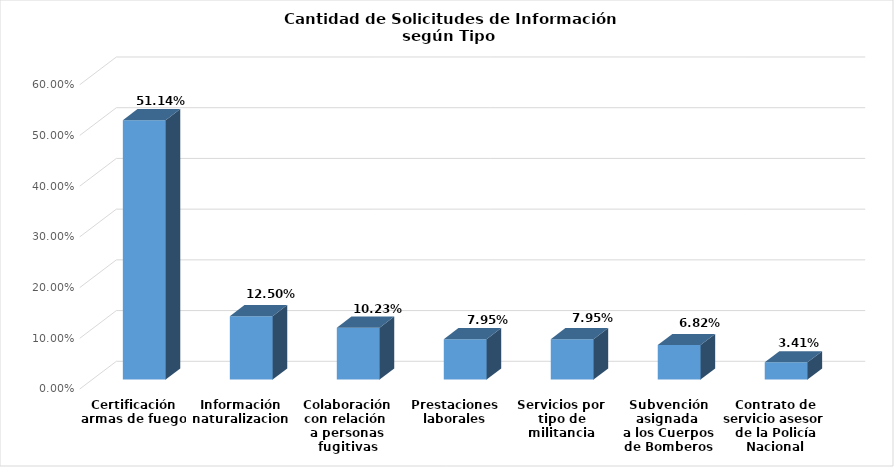
| Category | Series 0 |
|---|---|
| Certificación armas de fuego | 0.511 |
| Información naturalizacion | 0.125 |
| Colaboración con relación 
a personas fugitivas | 0.102 |
| Prestaciones laborales | 0.08 |
| Servicios por tipo de militancia | 0.08 |
| Subvención asignada 
a los Cuerpos de Bomberos | 0.068 |
| Contrato de servicio asesor 
de la Policía Nacional | 0.034 |